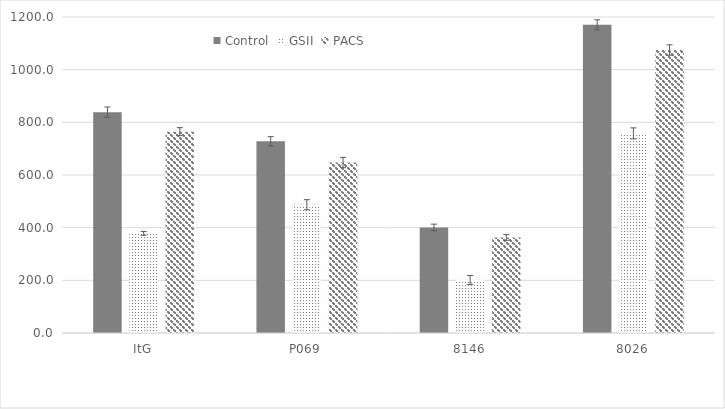
| Category | Control | GSII | PACS |
|---|---|---|---|
| ItG | 838.667 | 378.333 | 764.556 |
| P069 | 727.889 | 487.111 | 647.222 |
| 8146 | 400.778 | 201.556 | 362.889 |
| 8026 | 1170.111 | 758 | 1074.556 |